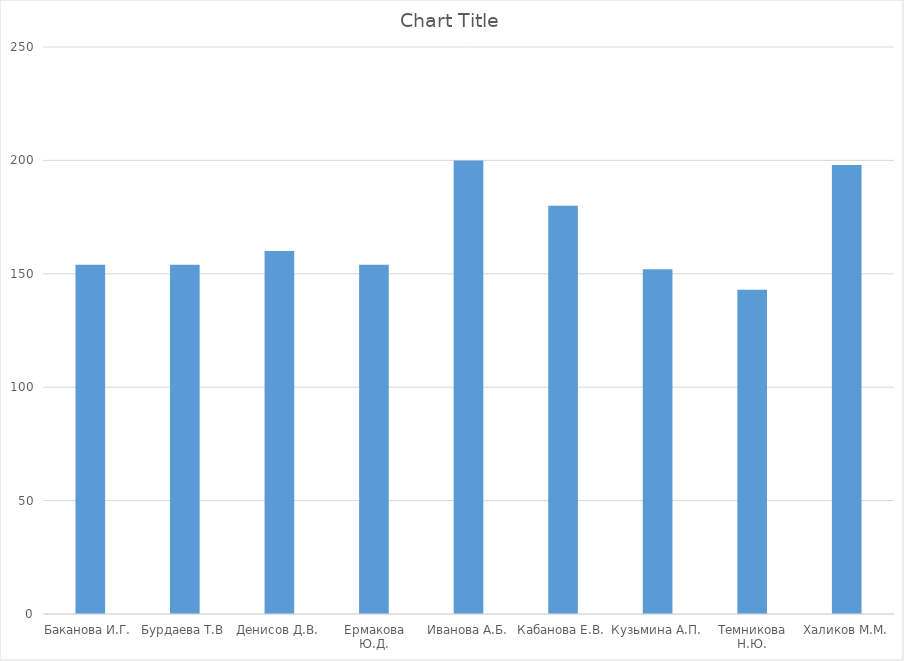
| Category | Series 0 |
|---|---|
| Баканова И.Г. | 154 |
| Бурдаева Т.В | 154 |
| Денисов Д.В. | 160 |
| Ермакова Ю.Д. | 154 |
| Иванова А.Б. | 200 |
| Кабанова Е.В. | 180 |
| Кузьмина А.П. | 152 |
| Темникова Н.Ю. | 143 |
| Халиков М.М. | 198 |